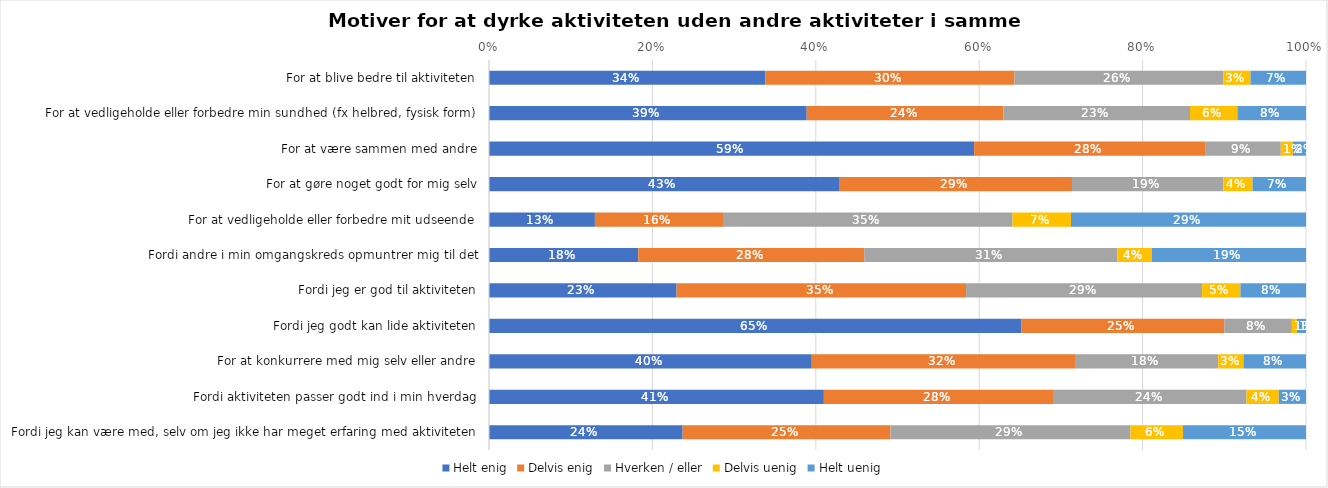
| Category | Helt enig | Delvis enig | Hverken / eller | Delvis uenig | Helt uenig |
|---|---|---|---|---|---|
| For at blive bedre til aktiviteten | 0.338 | 0.305 | 0.256 | 0.033 | 0.068 |
| For at vedligeholde eller forbedre min sundhed (fx helbred, fysisk form) | 0.389 | 0.241 | 0.228 | 0.058 | 0.084 |
| For at være sammen med andre | 0.594 | 0.283 | 0.093 | 0.015 | 0.016 |
| For at gøre noget godt for mig selv | 0.428 | 0.285 | 0.185 | 0.036 | 0.065 |
| For at vedligeholde eller forbedre mit udseende | 0.13 | 0.157 | 0.354 | 0.072 | 0.288 |
| Fordi andre i min omgangskreds opmuntrer mig til det | 0.183 | 0.277 | 0.31 | 0.042 | 0.189 |
| Fordi jeg er god til aktiviteten | 0.23 | 0.354 | 0.289 | 0.047 | 0.08 |
| Fordi jeg godt kan lide aktiviteten | 0.652 | 0.248 | 0.083 | 0.006 | 0.011 |
| For at konkurrere med mig selv eller andre | 0.395 | 0.322 | 0.175 | 0.031 | 0.077 |
| Fordi aktiviteten passer godt ind i min hverdag | 0.41 | 0.281 | 0.236 | 0.04 | 0.033 |
| Fordi jeg kan være med, selv om jeg ikke har meget erfaring med aktiviteten | 0.237 | 0.254 | 0.294 | 0.064 | 0.151 |